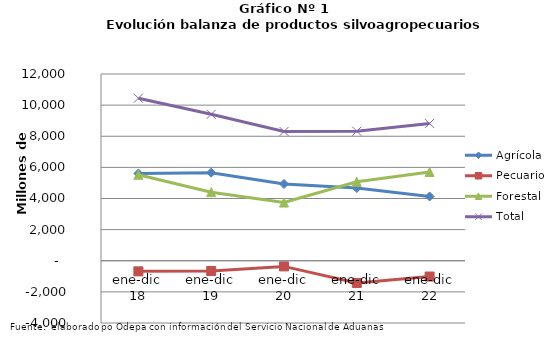
| Category | Agrícola | Pecuario | Forestal | Total |
|---|---|---|---|---|
| ene-dic 18 | 5603459 | -681642 | 5524149 | 10445966 |
| ene-dic 19 | 5658925 | -656228 | 4406874 | 9409571 |
| ene-dic 20 | 4932141 | -362821 | 3739043 | 8308363 |
| ene-dic 21 | 4672324 | -1424906 | 5074644 | 8322062 |
| ene-dic 22 | 4131717 | -1014546 | 5704534 | 8821705 |